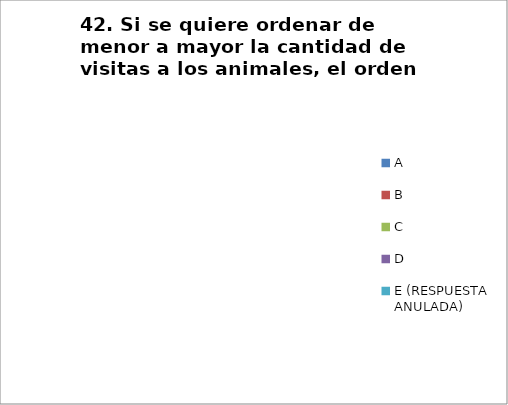
| Category | CANTIDAD DE RESPUESTAS PREGUNTA (42) | PORCENTAJE |
|---|---|---|
| A | 0 | 0 |
| B | 0 | 0 |
| C | 0 | 0 |
| D | 0 | 0 |
| E (RESPUESTA ANULADA) | 0 | 0 |